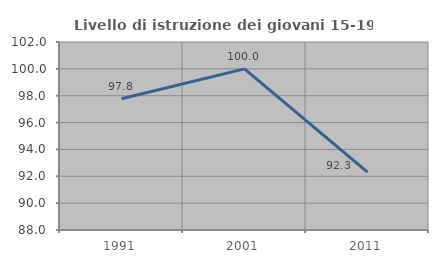
| Category | Livello di istruzione dei giovani 15-19 anni |
|---|---|
| 1991.0 | 97.778 |
| 2001.0 | 100 |
| 2011.0 | 92.308 |